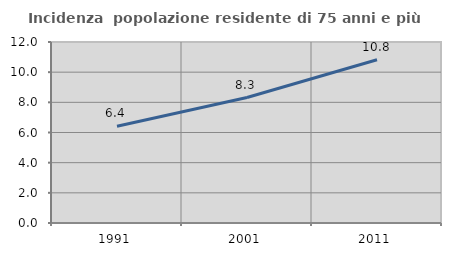
| Category | Incidenza  popolazione residente di 75 anni e più |
|---|---|
| 1991.0 | 6.41 |
| 2001.0 | 8.319 |
| 2011.0 | 10.825 |